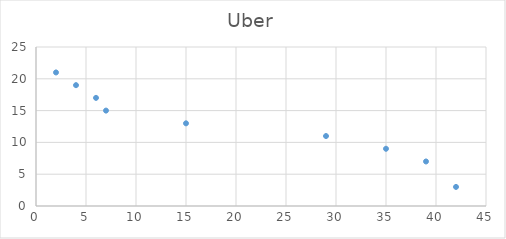
| Category | Uber |
|---|---|
| 42.0 | 3 |
| 39.0 | 7 |
| 35.0 | 9 |
| 29.0 | 11 |
| 15.0 | 13 |
| 7.0 | 15 |
| 6.0 | 17 |
| 4.0 | 19 |
| 2.0 | 21 |